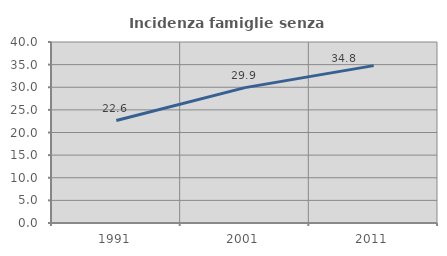
| Category | Incidenza famiglie senza nuclei |
|---|---|
| 1991.0 | 22.643 |
| 2001.0 | 29.916 |
| 2011.0 | 34.777 |